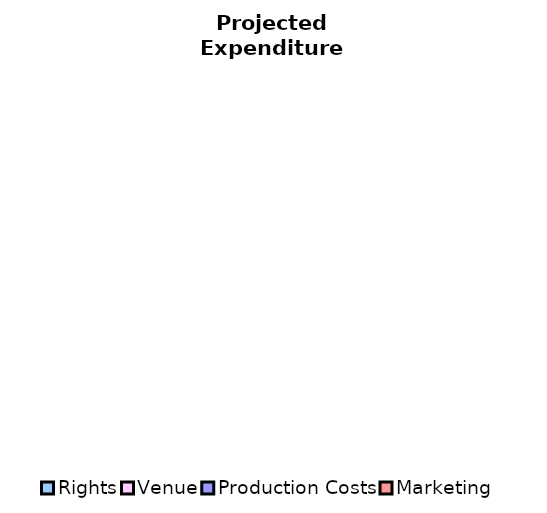
| Category | Series 0 |
|---|---|
| Rights | 0 |
| Venue | 0 |
| Production Costs | 0 |
| Marketing | 0 |